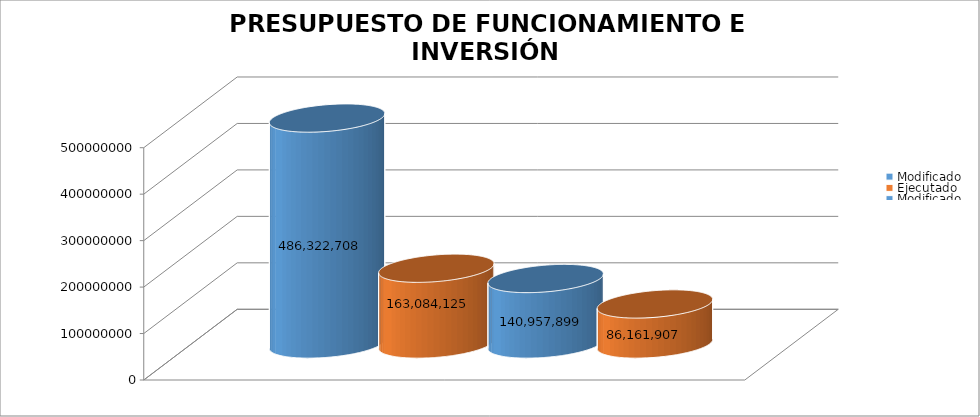
| Category | Modificado | Ejecutado | Series 2 |
|---|---|---|---|
| 0 | 140957899 | 86161907.03 |  |